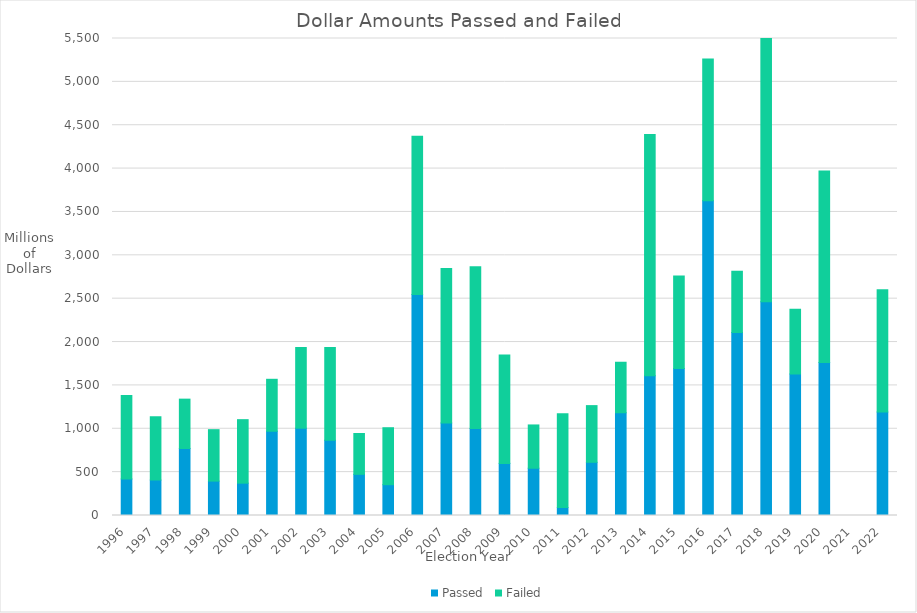
| Category | Passed | Failed |
|---|---|---|
| 1996 | 421404000 | 962286422 |
| 1997 | 408240000 | 729243606 |
| 1998 | 772752508 | 568890944 |
| 1999 | 396513000 | 593285497 |
| 2000 | 372854664 | 732265400 |
| 2001 | 971542500 | 598994564 |
| 2002 | 1006632066 | 930412984 |
| 2003 | 867987062 | 1068890777 |
| 2004 | 474388785 | 471257658 |
| 2005 | 355215839 | 656797586 |
| 2006 | 2548648970 | 1823933514 |
| 2007 | 1066782891 | 1781442844 |
| 2008 | 1002122000 | 1865605845 |
| 2009 | 600896550 | 1248876038 |
| 2010 | 544995000 | 499160000 |
| 2011 | 91490000 | 1082909702 |
| 2012 | 613531500 | 653475000 |
| 2013 | 1184837000 | 582293791 |
| 2014 | 1611200000 | 2781466156 |
| 2015 | 1696275474 | 1065535121 |
| 2016 | 3627959242 | 1636352563 |
| 2017 | 2110180773 | 706239039 |
| 2018 | 2463462812 | 3322431861 |
| 2019 | 1632908000 | 745700000 |
| 2020 | 1764800000 | 2207165000 |
| 2021 | 0 | 0 |
| 2022 | 1194397000 | 1409283270 |